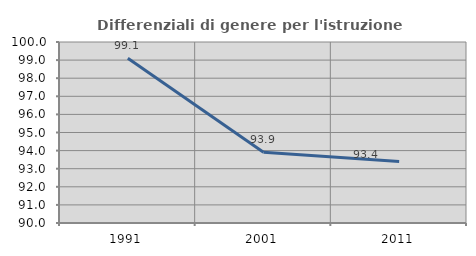
| Category | Differenziali di genere per l'istruzione superiore |
|---|---|
| 1991.0 | 99.097 |
| 2001.0 | 93.908 |
| 2011.0 | 93.404 |